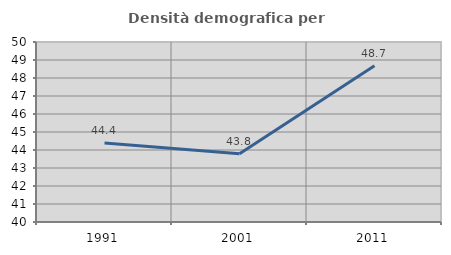
| Category | Densità demografica |
|---|---|
| 1991.0 | 44.383 |
| 2001.0 | 43.796 |
| 2011.0 | 48.684 |